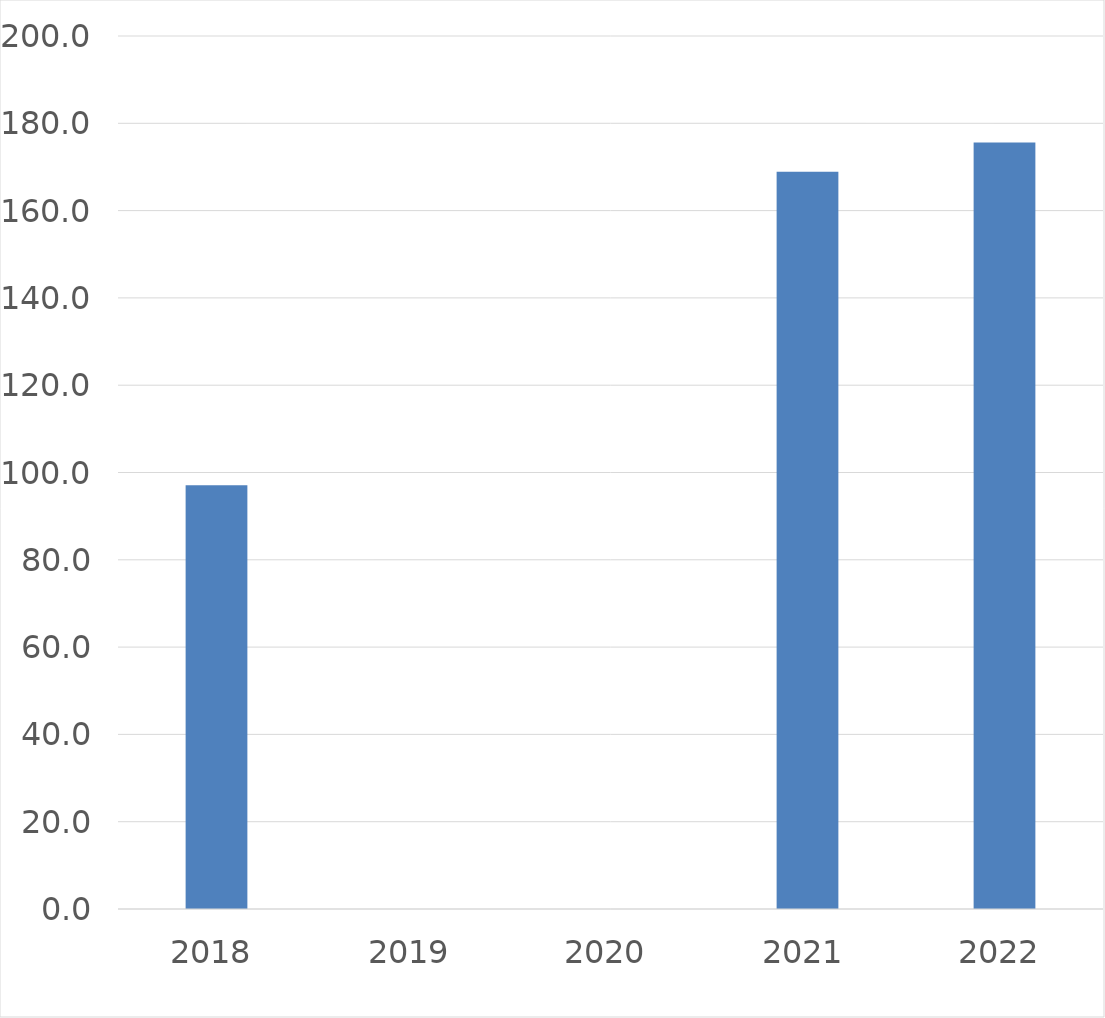
| Category | Series 0 |
|---|---|
| 2018 | 97.1 |
| 2019 | 0 |
| 2020 | 0 |
| 2021 | 168.9 |
| 2022 | 175.6 |